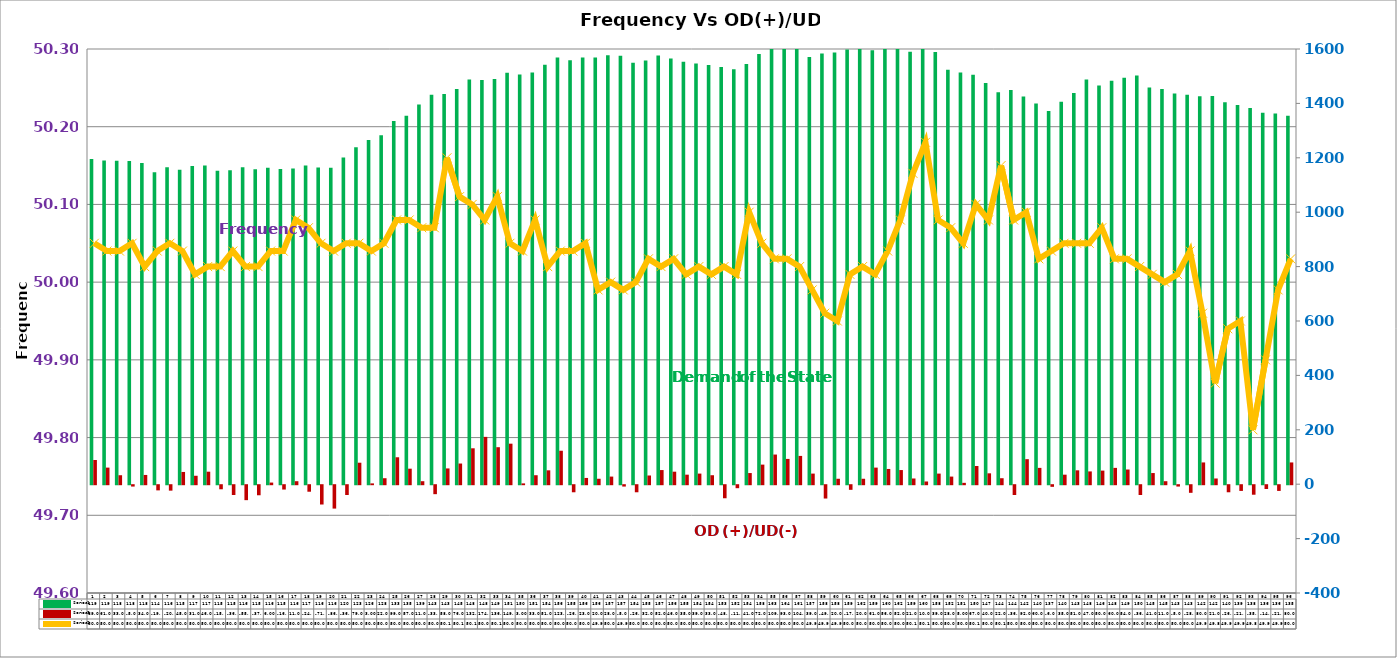
| Category | Series 2 | Series 4 |
|---|---|---|
| 0 | 1196 | 89 |
| 1 | 1190 | 61 |
| 2 | 1189 | 33 |
| 3 | 1188 | -5 |
| 4 | 1181 | 34 |
| 5 | 1147 | -19 |
| 6 | 1165 | -20 |
| 7 | 1156 | 45 |
| 8 | 1170 | 31 |
| 9 | 1172 | 46 |
| 10 | 1152 | -15 |
| 11 | 1154 | -36 |
| 12 | 1165 | -55 |
| 13 | 1158 | -37 |
| 14 | 1163 | 6 |
| 15 | 1159 | -16 |
| 16 | 1161 | 11 |
| 17 | 1172 | -24 |
| 18 | 1164 | -71 |
| 19 | 1163 | -86 |
| 20 | 1201 | -36 |
| 21 | 1239 | 79 |
| 22 | 1265 | 3 |
| 23 | 1283 | 22 |
| 24 | 1335 | 99 |
| 25 | 1355 | 57 |
| 26 | 1396 | 11 |
| 27 | 1432 | -33 |
| 28 | 1435 | 58 |
| 29 | 1453 | 76 |
| 30 | 1488 | 132 |
| 31 | 1486 | 174 |
| 32 | 1490 | 136 |
| 33 | 1513 | 149 |
| 34 | 1506 | 3 |
| 35 | 1514 | 33 |
| 36 | 1542 | 51 |
| 37 | 1569 | 123 |
| 38 | 1559 | -26 |
| 39 | 1569 | 23 |
| 40 | 1569 | 20 |
| 41 | 1577 | 28 |
| 42 | 1575 | -5 |
| 43 | 1549 | -26 |
| 44 | 1558 | 32 |
| 45 | 1576 | 52 |
| 46 | 1565 | 46 |
| 47 | 1553 | 35 |
| 48 | 1547 | 39 |
| 49 | 1541 | 33 |
| 50 | 1534 | -48 |
| 51 | 1526 | -11 |
| 52 | 1545 | 41 |
| 53 | 1582 | 72 |
| 54 | 1634 | 109 |
| 55 | 1644 | 93 |
| 56 | 1614 | 104 |
| 57 | 1571 | 39 |
| 58 | 1583 | -49 |
| 59 | 1587 | 20 |
| 60 | 1598 | -17 |
| 61 | 1620 | 20 |
| 62 | 1595 | 61 |
| 63 | 1607 | 56 |
| 64 | 1625 | 52 |
| 65 | 1590 | 21 |
| 66 | 1600 | 10 |
| 67 | 1589 | 39 |
| 68 | 1524 | 28 |
| 69 | 1514 | 5 |
| 70 | 1505 | 67 |
| 71 | 1475 | 40 |
| 72 | 1441 | 22 |
| 73 | 1449 | -36 |
| 74 | 1425 | 92 |
| 75 | 1400 | 60 |
| 76 | 1372 | -6 |
| 77 | 1406 | 35 |
| 78 | 1438 | 51 |
| 79 | 1488 | 47 |
| 80 | 1466 | 50 |
| 81 | 1483 | 60 |
| 82 | 1494 | 54 |
| 83 | 1503 | -36 |
| 84 | 1458 | 41 |
| 85 | 1453 | 11 |
| 86 | 1436 | -5 |
| 87 | 1432 | -28 |
| 88 | 1426 | 80 |
| 89 | 1427 | 21 |
| 90 | 1404 | -26 |
| 91 | 1394 | -21 |
| 92 | 1383 | -35 |
| 93 | 1366 | -14 |
| 94 | 1363 | -21 |
| 95 | 1355 | 80 |